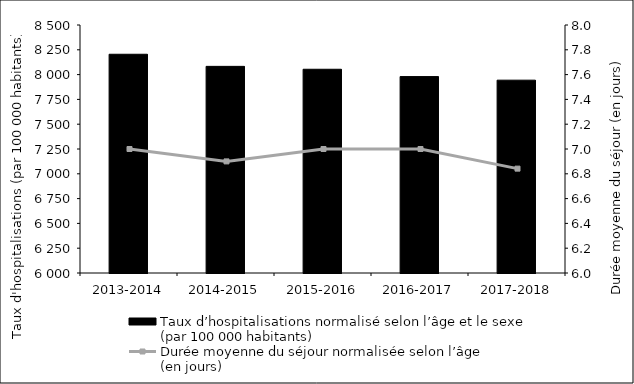
| Category | Taux d’hospitalisations normalisé selon l’âge et le sexe 
(par 100 000 habitants) |
|---|---|
| 2013-2014 | 8205 |
| 2014-2015 | 8083 |
| 2015-2016 | 8053.914 |
| 2016-2017 | 7980 |
| 2017-2018 | 7943.875 |